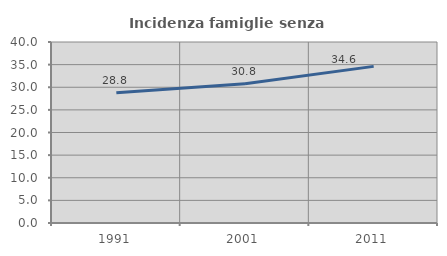
| Category | Incidenza famiglie senza nuclei |
|---|---|
| 1991.0 | 28.767 |
| 2001.0 | 30.769 |
| 2011.0 | 34.615 |